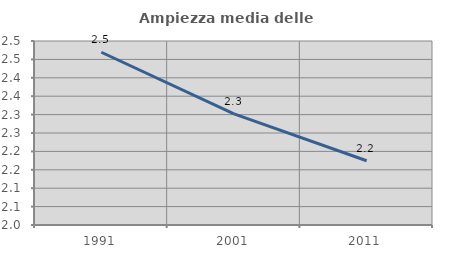
| Category | Ampiezza media delle famiglie |
|---|---|
| 1991.0 | 2.469 |
| 2001.0 | 2.302 |
| 2011.0 | 2.175 |